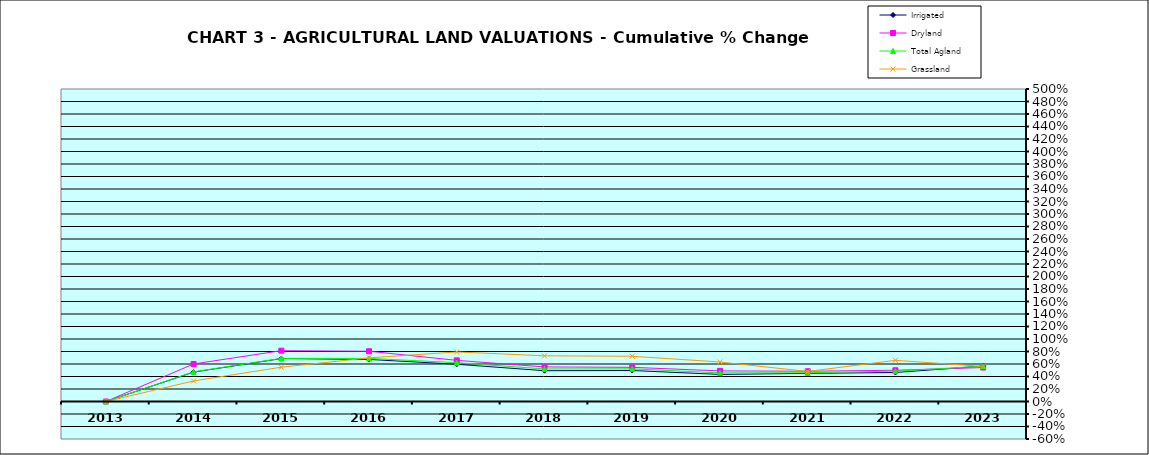
| Category | Irrigated | Dryland | Total Agland | Grassland |
|---|---|---|---|---|
| 2013.0 | 0 | 0 | 0 | 0 |
| 2014.0 | 0.471 | 0.6 | 0.474 | 0.328 |
| 2015.0 | 0.687 | 0.813 | 0.69 | 0.549 |
| 2016.0 | 0.673 | 0.804 | 0.69 | 0.698 |
| 2017.0 | 0.596 | 0.658 | 0.621 | 0.793 |
| 2018.0 | 0.493 | 0.553 | 0.521 | 0.731 |
| 2019.0 | 0.496 | 0.547 | 0.522 | 0.724 |
| 2020.0 | 0.433 | 0.49 | 0.458 | 0.632 |
| 2021.0 | 0.45 | 0.484 | 0.459 | 0.481 |
| 2022.0 | 0.464 | 0.5 | 0.486 | 0.659 |
| 2023.0 | 0.567 | 0.543 | 0.565 | 0.561 |